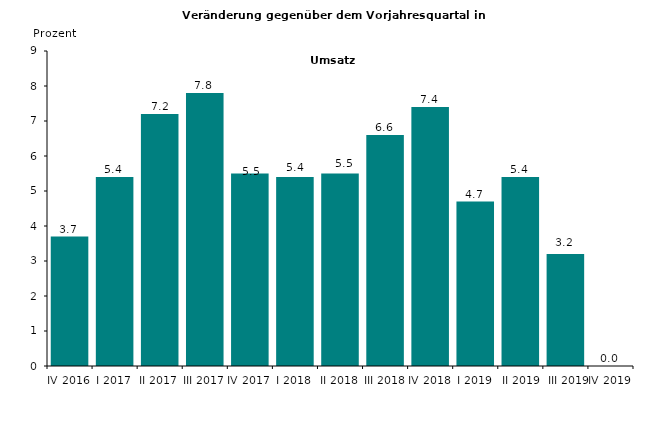
| Category | Series 0 |
|---|---|
| IV 2016 | 3.7 |
| I 2017 | 5.4 |
| II 2017 | 7.2 |
| III 2017 | 7.8 |
| IV 2017 | 5.5 |
| I 2018 | 5.4 |
| II 2018 | 5.5 |
| III 2018 | 6.6 |
| IV 2018 | 7.4 |
| I 2019 | 4.7 |
|  II 2019 | 5.4 |
|  III 2019 | 3.2 |
| IV 2019 | 0 |